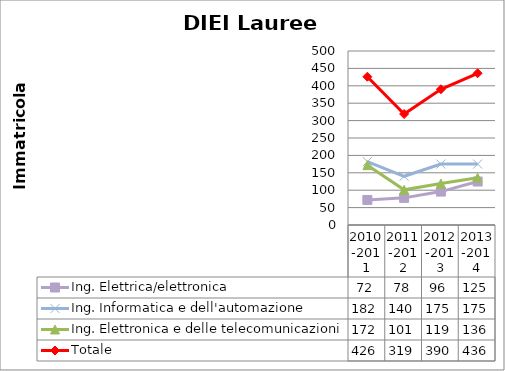
| Category | Ing. Elettrica/elettronica | Ing. Informatica e dell'automazione | Ing. Elettronica e delle telecomunicazioni | Totale |
|---|---|---|---|---|
| 2010-2011 | 72 | 182 | 172 | 426 |
| 2011-2012 | 78 | 140 | 101 | 319 |
| 2012-2013 | 96 | 175 | 119 | 390 |
| 2013-2014 | 125 | 175 | 136 | 436 |